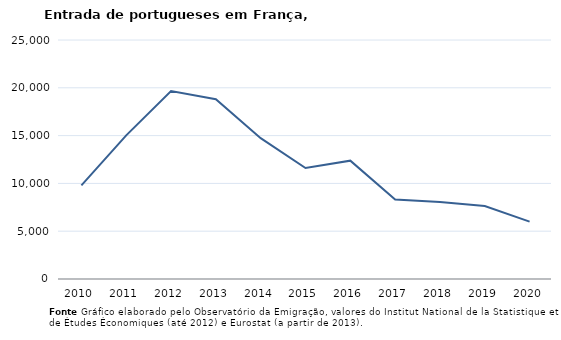
| Category | Entradas |
|---|---|
| 2010.0 | 9801 |
| 2011.0 | 15023 |
| 2012.0 | 19658 |
| 2013.0 | 18803 |
| 2014.0 | 14732 |
| 2015.0 | 11607 |
| 2016.0 | 12377 |
| 2017.0 | 8314 |
| 2018.0 | 8047 |
| 2019.0 | 7643 |
| 2020.0 | 5998 |